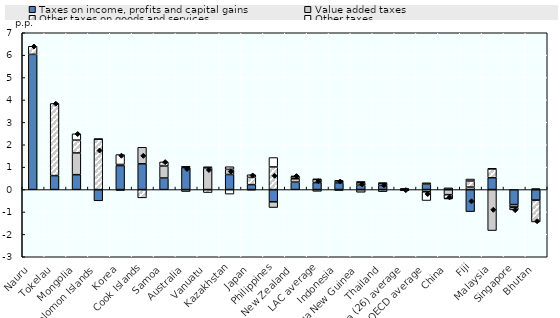
| Category | Taxes on income, profits and capital gains | Value added taxes | Other taxes on goods and services | Other taxes |
|---|---|---|---|---|
| Nauru | 6.036 | 0 | 0.361 | 0 |
| Tokelau | 0.622 | 0 | 3.22 | 0 |
| Mongolia | 0.665 | 0.969 | 0.572 | 0.283 |
| Solomon Islands | -0.502 | 0 | 2.252 | 0.003 |
| Korea | 1.07 | 0.049 | -0.04 | 0.443 |
| Cook Islands | 1.15 | 0.738 | -0.37 | 0 |
| Samoa | 0.515 | 0.533 | 0.185 | 0 |
| Australia | 0.982 | -0.088 | 0.031 | 0.004 |
| Vanuatu | 0 | 0.966 | -0.134 | 0.052 |
| Kazakhstan | 0.672 | 0.229 | 0.118 | -0.204 |
| Japan | 0.22 | -0.022 | 0.323 | 0.119 |
| Philippines | -0.548 | -0.255 | 1.009 | 0.42 |
| New Zealand | 0.331 | 0.149 | 0.092 | 0.036 |
| LAC average | 0.311 | 0.145 | -0.08 | 0.006 |
| Indonesia | 0.294 | 0.089 | -0.041 | 0.026 |
| Papua New Guinea | 0.193 | -0.121 | 0.108 | 0.061 |
| Thailand | 0.187 | 0.098 | -0.094 | 0.009 |
| Africa (26) average | -0.015 | 0.025 | -0.04 | 0.014 |
| OECD average | 0.246 | 0.057 | -0.101 | -0.388 |
| China | 0.077 | -0.228 | -0.171 | -0.016 |
| Fiji | -0.984 | 0.109 | 0.272 | 0.089 |
| Malaysia | 0.528 | -1.83 | 0.397 | 0.013 |
| Singapore | -0.67 | -0.109 | -0.028 | -0.099 |
| Bhutan | -0.472 | 0 | -0.975 | 0.045 |